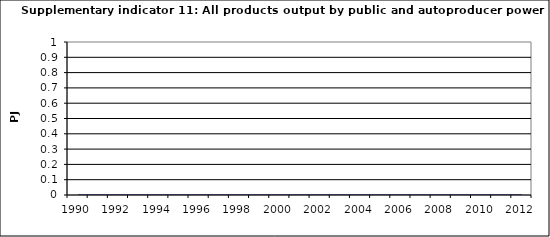
| Category | All products output by public and autoproducer power stations, PJ |
|---|---|
| 1990 | 0 |
| 1991 | 0 |
| 1992 | 0 |
| 1993 | 0 |
| 1994 | 0 |
| 1995 | 0 |
| 1996 | 0 |
| 1997 | 0 |
| 1998 | 0 |
| 1999 | 0 |
| 2000 | 0 |
| 2001 | 0 |
| 2002 | 0 |
| 2003 | 0 |
| 2004 | 0 |
| 2005 | 0 |
| 2006 | 0 |
| 2007 | 0 |
| 2008 | 0 |
| 2009 | 0 |
| 2010 | 0 |
| 2011 | 0 |
| 2012 | 0 |